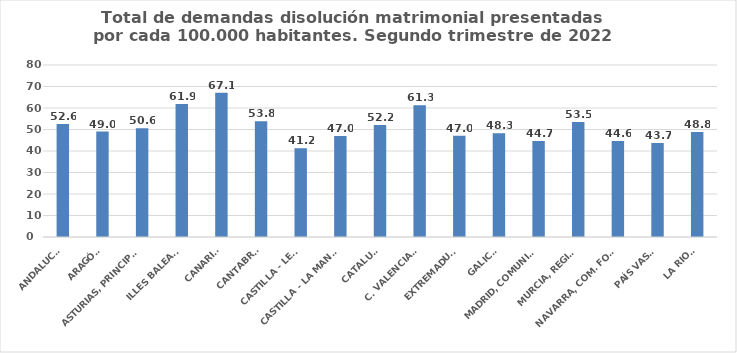
| Category | Series 0 |
|---|---|
| ANDALUCÍA | 52.575 |
| ARAGÓN | 49.044 |
| ASTURIAS, PRINCIPADO | 50.572 |
| ILLES BALEARS | 61.891 |
| CANARIAS | 67.129 |
| CANTABRIA | 53.826 |
| CASTILLA - LEÓN | 41.223 |
| CASTILLA - LA MANCHA | 47.023 |
| CATALUÑA | 52.15 |
| C. VALENCIANA | 61.267 |
| EXTREMADURA | 47.048 |
| GALICIA | 48.305 |
| MADRID, COMUNIDAD | 44.703 |
| MURCIA, REGIÓN | 53.544 |
| NAVARRA, COM. FORAL | 44.604 |
| PAÍS VASCO | 43.721 |
| LA RIOJA | 48.829 |